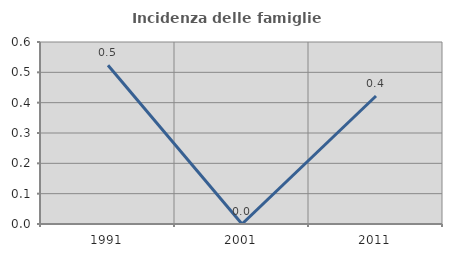
| Category | Incidenza delle famiglie numerose |
|---|---|
| 1991.0 | 0.524 |
| 2001.0 | 0 |
| 2011.0 | 0.422 |